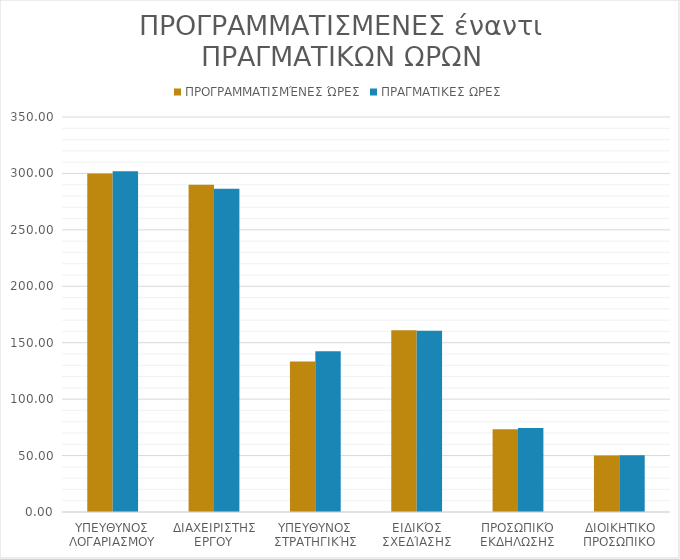
| Category | ΠΡΟΓΡΑΜΜΑΤΙΣΜΈΝΕΣ ΏΡΕΣ | ΠΡΑΓΜΑΤΙΚΕΣ ΩΡΕΣ |
|---|---|---|
| ΥΠΕΥΘΥΝΟΣ ΛΟΓΑΡΙΑΣΜΟΥ | 300 | 302 |
| ΔΙΑΧΕΙΡΙΣΤΗΣ ΕΡΓΟΥ | 290 | 286.333 |
| ΥΠΕΥΘΥΝΟΣ ΣΤΡΑΤΗΓΙΚΉΣ | 133.333 | 142.5 |
| ΕΙΔΙΚΌΣ ΣΧΕΔΊΑΣΗΣ | 161.111 | 160.556 |
| ΠΡΟΣΩΠΙΚΌ ΕΚΔΗΛΩΣΗΣ | 73.333 | 74.444 |
| ΔΙΟΙΚΗΤΙΚΟ ΠΡΟΣΩΠΙΚΟ | 50 | 50.333 |